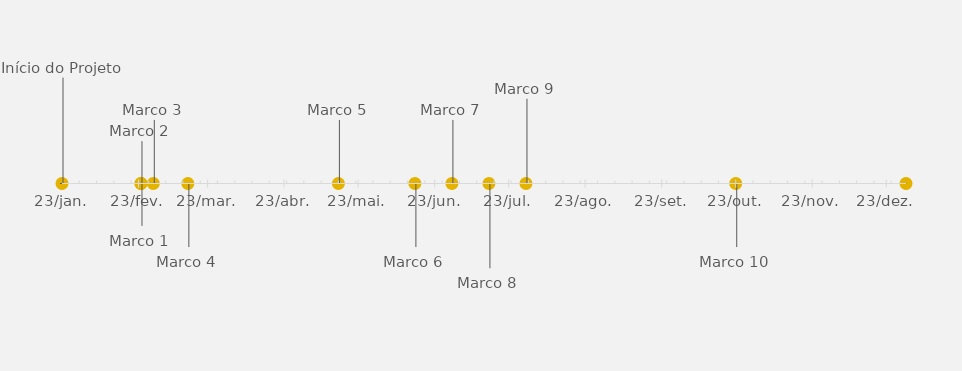
| Category | POSIÇÃO |
|---|---|
| Início do Projeto | 25 |
| Marco 1 | -10 |
| Marco 2 | 10 |
| Marco 3 | 15 |
| Marco 4 | -15 |
| Marco 5 | 15 |
| Marco 6 | -15 |
| Marco 7 | 15 |
| Marco 8 | -20 |
| Marco 9 | 20 |
| Marco 10 | -15 |
| Fim do Projeto | 15 |